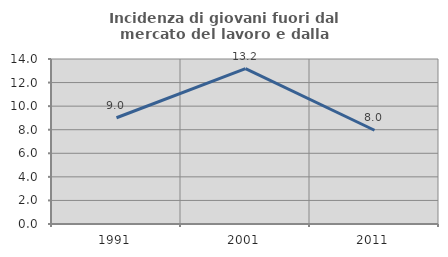
| Category | Incidenza di giovani fuori dal mercato del lavoro e dalla formazione  |
|---|---|
| 1991.0 | 9.016 |
| 2001.0 | 13.187 |
| 2011.0 | 7.955 |